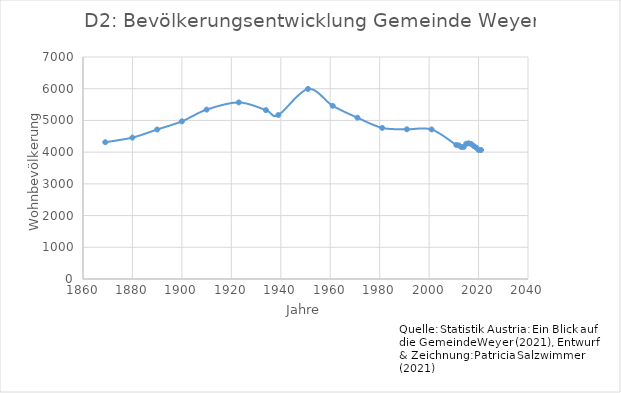
| Category | Bevölkerungsdaten  |
|---|---|
| 1869.0 | 4313 |
| 1880.0 | 4459 |
| 1890.0 | 4713 |
| 1900.0 | 4971 |
| 1910.0 | 5341 |
| 1923.0 | 5568 |
| 1934.0 | 5325 |
| 1939.0 | 5170 |
| 1951.0 | 5993 |
| 1961.0 | 5461 |
| 1971.0 | 5087 |
| 1981.0 | 4765 |
| 1991.0 | 4721 |
| 2001.0 | 4716 |
| 2011.0 | 4226 |
| 2012.0 | 4213 |
| 2013.0 | 4163 |
| 2014.0 | 4161 |
| 2015.0 | 4264 |
| 2016.0 | 4278 |
| 2017.0 | 4258 |
| 2018.0 | 4197 |
| 2019.0 | 4143 |
| 2020.0 | 4068 |
| 2021.0 | 4068 |